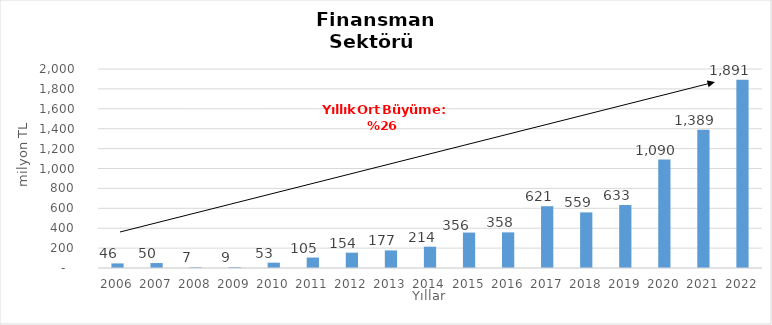
| Category | Finansman |
|---|---|
| 2006.0 | 46.209 |
| 2007.0 | 49.659 |
| 2008.0 | 7.339 |
| 2009.0 | 8.77 |
| 2010.0 | 53.492 |
| 2011.0 | 105.032 |
| 2012.0 | 154.13 |
| 2013.0 | 176.798 |
| 2014.0 | 214.053 |
| 2015.0 | 356 |
| 2016.0 | 358 |
| 2017.0 | 621 |
| 2018.0 | 559 |
| 2019.0 | 633 |
| 2020.0 | 1090 |
| 2021.0 | 1389 |
| 2022.0 | 1891 |